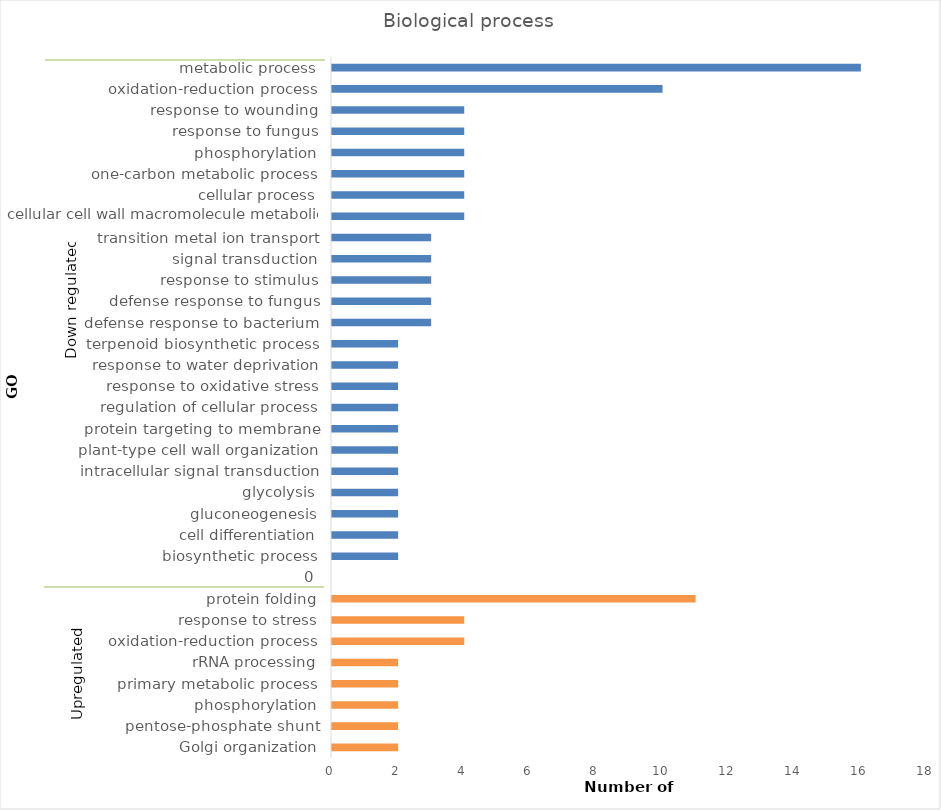
| Category | Biolo_upreg |
|---|---|
| _x0012_Golgi organization | 2 |
| _x0017_pentose-phosphate shunt | 2 |
| _x000f_phosphorylation | 2 |
| _x0019_primary metabolic process | 2 |
| _x000f_rRNA processing | 2 |
| _x001b_oxidation-reduction process | 4 |
| _x0012_response to stress | 4 |
| _x000f_protein folding | 11 |
| _x0001_0 | 0 |
| _x0014_biosynthetic process | 2 |
| _x0014_cell differentiation | 2 |
| _x000f_gluconeogenesis | 2 |
| 
glycolysis | 2 |
| !intracellular signal transduction | 2 |
| !plant-type cell wall organization | 2 |
| _x001d_protein targeting to membrane | 2 |
| _x001e_regulation of cellular process | 2 |
| _x001c_response to oxidative stress | 2 |
| _x001d_response to water deprivation | 2 |
| _x001e_terpenoid biosynthetic process | 2 |
| _x001d_defense response to bacterium | 3 |
| _x001a_defense response to fungus | 3 |
| _x0014_response to stimulus | 3 |
| _x0013_signal transduction | 3 |
| _x001e_transition metal ion transport | 3 |
| 2cellular cell wall macromolecule metabolic process | 4 |
| _x0010_cellular process | 4 |
| _x001c_one-carbon metabolic process | 4 |
| _x000f_phosphorylation | 4 |
| _x0012_response to fungus | 4 |
| _x0014_response to wounding | 4 |
| _x001b_oxidation-reduction process | 10 |
| _x0011_metabolic process | 16 |